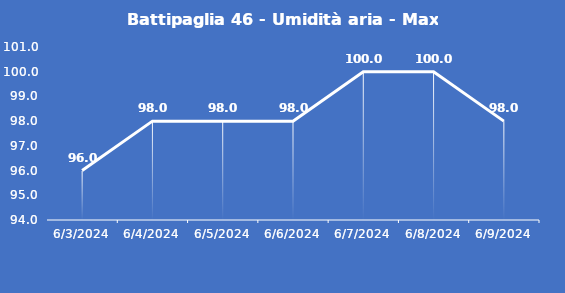
| Category | Battipaglia 46 - Umidità aria - Max (%) |
|---|---|
| 6/3/24 | 96 |
| 6/4/24 | 98 |
| 6/5/24 | 98 |
| 6/6/24 | 98 |
| 6/7/24 | 100 |
| 6/8/24 | 100 |
| 6/9/24 | 98 |